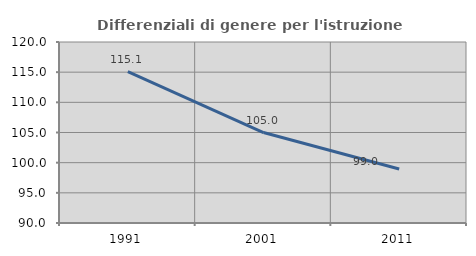
| Category | Differenziali di genere per l'istruzione superiore |
|---|---|
| 1991.0 | 115.09 |
| 2001.0 | 104.994 |
| 2011.0 | 98.955 |